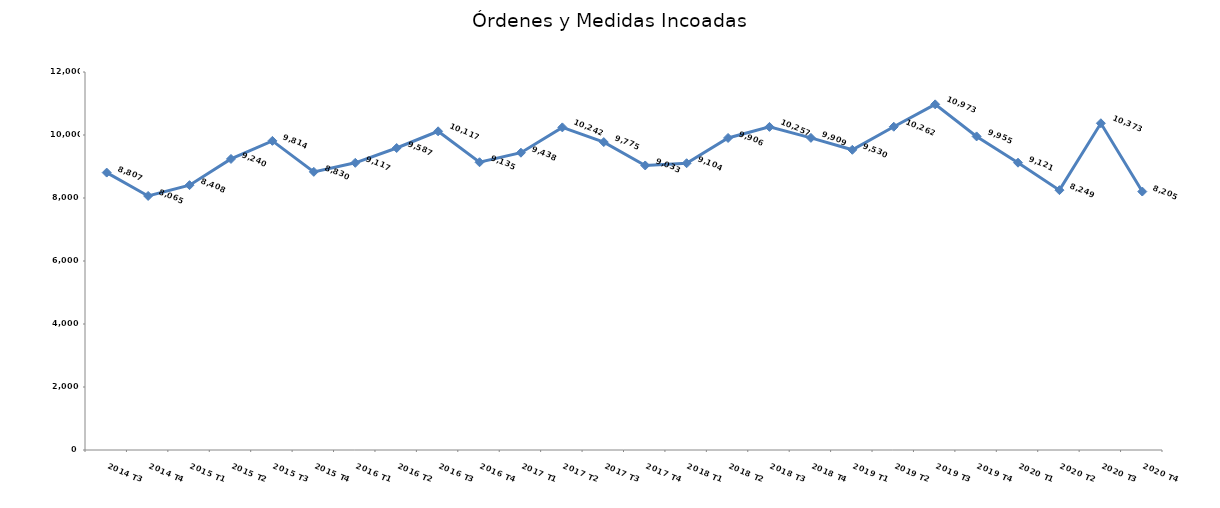
| Category | Series 0 |
|---|---|
| 2014 T3 | 8807 |
| 2014 T4 | 8065 |
| 2015 T1 | 8408 |
| 2015 T2 | 9240 |
| 2015 T3 | 9814 |
| 2015 T4 | 8830 |
| 2016 T1 | 9117 |
| 2016 T2 | 9587 |
| 2016 T3 | 10117 |
| 2016 T4 | 9135 |
| 2017 T1 | 9438 |
| 2017 T2 | 10242 |
| 2017 T3 | 9775 |
| 2017 T4 | 9033 |
| 2018 T1 | 9104 |
| 2018 T2 | 9906 |
| 2018 T3 | 10257 |
| 2018 T4 | 9909 |
| 2019 T1 | 9530 |
| 2019 T2 | 10262 |
| 2019 T3 | 10973 |
| 2019 T4 | 9955 |
| 2020 T1 | 9121 |
| 2020 T2 | 8249 |
| 2020 T3 | 10373 |
| 2020 T4 | 8205 |